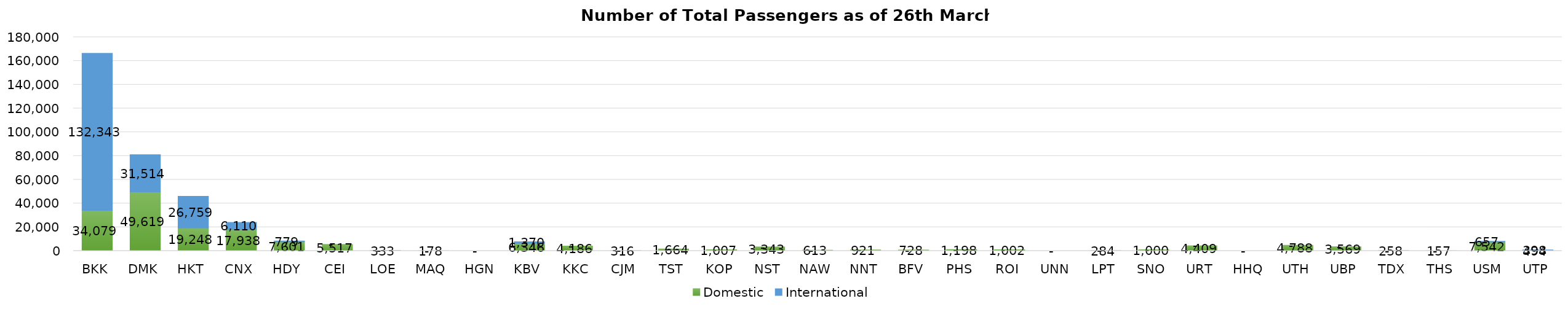
| Category | Domestic | International |
|---|---|---|
| BKK | 34079 | 132343 |
| DMK | 49619 | 31514 |
| HKT | 19248 | 26759 |
| CNX | 17938 | 6110 |
| HDY | 7601 | 779 |
| CEI | 5517 | 0 |
| LOE | 333 | 0 |
| MAQ | 178 | 0 |
| HGN | 0 | 0 |
| KBV | 6346 | 1370 |
| KKC | 4186 | 0 |
| CJM | 316 | 0 |
| TST | 1664 | 0 |
| KOP | 1007 | 0 |
| NST | 3343 | 0 |
| NAW | 613 | 0 |
| NNT | 921 | 0 |
| BFV | 728 | 0 |
| PHS | 1198 | 0 |
| ROI | 1002 | 0 |
| UNN | 0 | 0 |
| LPT | 284 | 0 |
| SNO | 1000 | 0 |
| URT | 4409 | 0 |
| HHQ | 0 | 0 |
| UTH | 4788 | 0 |
| UBP | 3569 | 0 |
| TDX | 258 | 0 |
| THS | 157 | 0 |
| USM | 7542 | 657 |
| UTP | 494 | 398 |